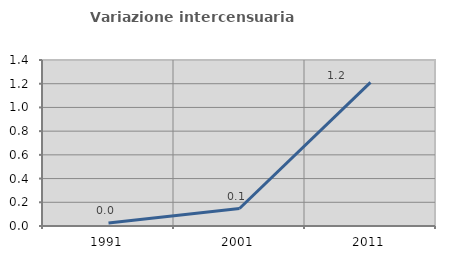
| Category | Variazione intercensuaria annua |
|---|---|
| 1991.0 | 0.026 |
| 2001.0 | 0.147 |
| 2011.0 | 1.212 |